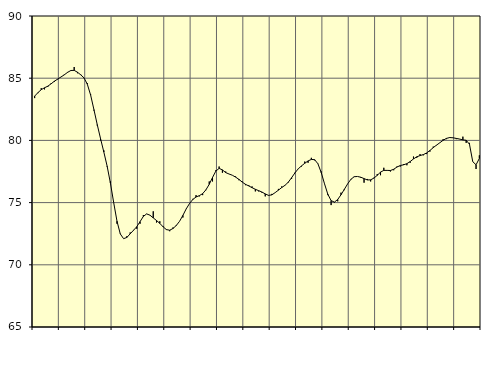
| Category | Piggar | Series 1 |
|---|---|---|
| nan | 83.4 | 83.56 |
| 87.0 | 83.8 | 83.84 |
| 87.0 | 84.2 | 84.08 |
| 87.0 | 84.1 | 84.23 |
| nan | 84.3 | 84.36 |
| 88.0 | 84.6 | 84.55 |
| 88.0 | 84.7 | 84.76 |
| 88.0 | 84.9 | 84.93 |
| nan | 85.1 | 85.1 |
| 89.0 | 85.3 | 85.27 |
| 89.0 | 85.5 | 85.47 |
| 89.0 | 85.6 | 85.62 |
| nan | 85.9 | 85.63 |
| 90.0 | 85.4 | 85.48 |
| 90.0 | 85.3 | 85.27 |
| 90.0 | 85 | 85.02 |
| nan | 84.6 | 84.51 |
| 91.0 | 83.7 | 83.64 |
| 91.0 | 82.4 | 82.47 |
| 91.0 | 81.2 | 81.27 |
| nan | 80 | 80.15 |
| 92.0 | 79.2 | 79.07 |
| 92.0 | 77.9 | 77.94 |
| 92.0 | 76.7 | 76.57 |
| nan | 75 | 74.99 |
| 93.0 | 73.3 | 73.5 |
| 93.0 | 72.5 | 72.48 |
| 93.0 | 72.1 | 72.1 |
| nan | 72.3 | 72.2 |
| 94.0 | 72.6 | 72.49 |
| 94.0 | 72.8 | 72.77 |
| 94.0 | 72.9 | 73.06 |
| nan | 73.3 | 73.47 |
| 95.0 | 74 | 73.89 |
| 95.0 | 74.1 | 74.09 |
| 95.0 | 74 | 73.99 |
| nan | 74.3 | 73.77 |
| 96.0 | 73.4 | 73.56 |
| 96.0 | 73.5 | 73.33 |
| 96.0 | 73.1 | 73.05 |
| nan | 72.8 | 72.83 |
| 97.0 | 72.7 | 72.78 |
| 97.0 | 73 | 72.92 |
| 97.0 | 73.2 | 73.16 |
| nan | 73.5 | 73.5 |
| 98.0 | 73.8 | 73.97 |
| 98.0 | 74.5 | 74.49 |
| 98.0 | 74.9 | 74.92 |
| nan | 75.3 | 75.25 |
| 99.0 | 75.6 | 75.45 |
| 99.0 | 75.5 | 75.56 |
| 99.0 | 75.6 | 75.72 |
| nan | 76 | 76.03 |
| 0.0 | 76.7 | 76.47 |
| 0.0 | 76.7 | 77.02 |
| 0.0 | 77.6 | 77.53 |
| nan | 77.9 | 77.75 |
| 1.0 | 77.4 | 77.63 |
| 1.0 | 77.5 | 77.41 |
| 1.0 | 77.3 | 77.3 |
| nan | 77.2 | 77.2 |
| 2.0 | 77.1 | 77.05 |
| 2.0 | 76.8 | 76.87 |
| 2.0 | 76.7 | 76.65 |
| nan | 76.4 | 76.47 |
| 3.0 | 76.4 | 76.34 |
| 3.0 | 76.3 | 76.2 |
| 3.0 | 75.9 | 76.07 |
| nan | 75.9 | 75.96 |
| 4.0 | 75.8 | 75.85 |
| 4.0 | 75.5 | 75.7 |
| 4.0 | 75.6 | 75.58 |
| nan | 75.7 | 75.62 |
| 5.0 | 75.8 | 75.8 |
| 5.0 | 76.1 | 76 |
| 5.0 | 76.3 | 76.21 |
| nan | 76.4 | 76.39 |
| 6.0 | 76.6 | 76.64 |
| 6.0 | 76.9 | 77 |
| 6.0 | 77.4 | 77.38 |
| nan | 77.7 | 77.71 |
| 7.0 | 77.9 | 77.95 |
| 7.0 | 78.3 | 78.16 |
| 7.0 | 78.2 | 78.35 |
| nan | 78.6 | 78.47 |
| 8.0 | 78.4 | 78.45 |
| 8.0 | 78.1 | 78.12 |
| 8.0 | 77.5 | 77.41 |
| nan | 76.5 | 76.51 |
| 9.0 | 75.6 | 75.67 |
| 9.0 | 74.8 | 75.16 |
| 9.0 | 75 | 75.04 |
| nan | 75.1 | 75.25 |
| 10.0 | 75.8 | 75.63 |
| 10.0 | 76 | 76.06 |
| 10.0 | 76.5 | 76.5 |
| nan | 76.9 | 76.87 |
| 11.0 | 77.1 | 77.08 |
| 11.0 | 77.1 | 77.1 |
| 11.0 | 77 | 77.04 |
| nan | 76.6 | 76.93 |
| 12.0 | 76.9 | 76.82 |
| 12.0 | 76.7 | 76.83 |
| 12.0 | 77 | 76.97 |
| nan | 77.3 | 77.19 |
| 13.0 | 77.2 | 77.45 |
| 13.0 | 77.8 | 77.59 |
| 13.0 | 77.6 | 77.59 |
| nan | 77.5 | 77.58 |
| 14.0 | 77.6 | 77.68 |
| 14.0 | 77.9 | 77.86 |
| 14.0 | 77.9 | 77.98 |
| nan | 78.1 | 78.04 |
| 15.0 | 78 | 78.13 |
| 15.0 | 78.2 | 78.3 |
| 15.0 | 78.7 | 78.51 |
| nan | 78.6 | 78.68 |
| 16.0 | 78.9 | 78.78 |
| 16.0 | 78.8 | 78.86 |
| 16.0 | 78.9 | 78.99 |
| nan | 79.1 | 79.19 |
| 17.0 | 79.5 | 79.42 |
| 17.0 | 79.6 | 79.62 |
| 17.0 | 79.8 | 79.81 |
| nan | 80.1 | 80.01 |
| 18.0 | 80.1 | 80.16 |
| 18.0 | 80.2 | 80.23 |
| 18.0 | 80.2 | 80.21 |
| nan | 80.1 | 80.16 |
| 19.0 | 80.1 | 80.11 |
| 19.0 | 80.3 | 80.04 |
| 19.0 | 79.8 | 80.01 |
| nan | 79.8 | 79.69 |
| 20.0 | 78.3 | 78.29 |
| 20.0 | 77.7 | 78.04 |
| 20.0 | 78.8 | 78.55 |